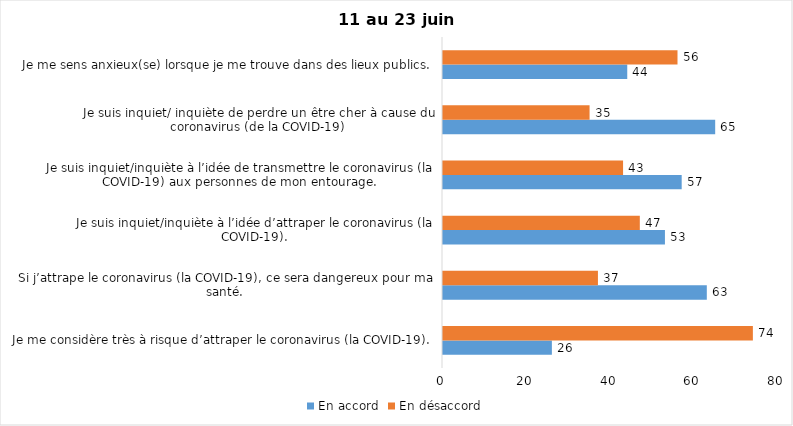
| Category | En accord | En désaccord |
|---|---|---|
| Je me considère très à risque d’attraper le coronavirus (la COVID-19). | 26 | 74 |
| Si j’attrape le coronavirus (la COVID-19), ce sera dangereux pour ma santé. | 63 | 37 |
| Je suis inquiet/inquiète à l’idée d’attraper le coronavirus (la COVID-19). | 53 | 47 |
| Je suis inquiet/inquiète à l’idée de transmettre le coronavirus (la COVID-19) aux personnes de mon entourage. | 57 | 43 |
| Je suis inquiet/ inquiète de perdre un être cher à cause du coronavirus (de la COVID-19) | 65 | 35 |
| Je me sens anxieux(se) lorsque je me trouve dans des lieux publics. | 44 | 56 |